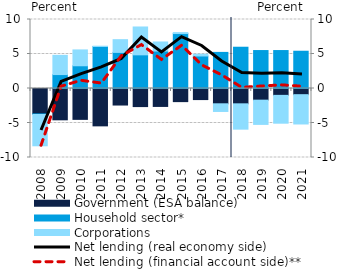
| Category | Government (ESA balance) | Household sector* | Corporations |
|---|---|---|---|
| 2008.0 | -3.681 | -0.087 | -4.535 |
| 2009.0 | -4.539 | 2.02 | 2.786 |
| 2010.0 | -4.474 | 3.294 | 2.298 |
| 2011.0 | -5.414 | 6.086 | 0.042 |
| 2012.0 | -2.396 | 5.231 | 1.848 |
| 2013.0 | -2.621 | 4.878 | 4.038 |
| 2014.0 | -2.599 | 5.43 | 1.311 |
| 2015.0 | -1.902 | 7.964 | 0.134 |
| 2016.0 | -1.605 | 4.713 | 0.253 |
| 2017.0 | -2.217 | 5.232 | -1.112 |
| 2018.0 | -2.221 | 5.981 | -3.671 |
| 2019.0 | -1.689 | 5.5 | -3.514 |
| 2020.0 | -0.995 | 5.5 | -4.035 |
| 2021.0 | -0.895 | 5.4 | -4.247 |